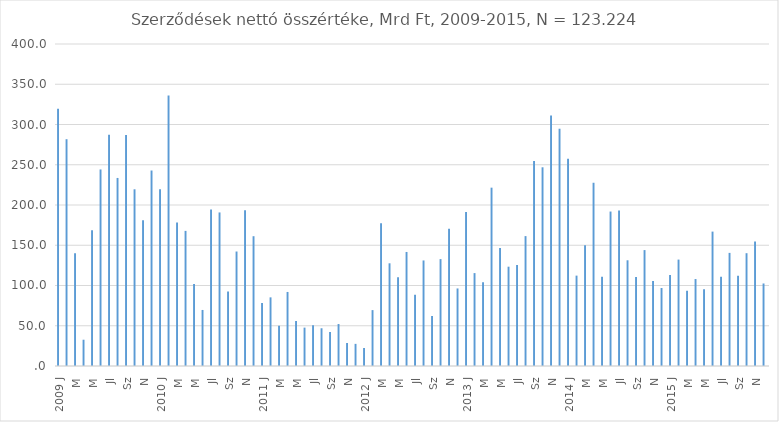
| Category | Series 0 | Series 1 |
|---|---|---|
| 2009 J | 319.526 | 0 |
| F | 281.743 | 0 |
| M | 140.104 | 0 |
| A | 32.635 | 0 |
| M | 168.664 | 0 |
| Jn | 244.154 | 0 |
| Jl | 287.342 | 0 |
| A | 233.607 | 0 |
| Sz | 286.963 | 0 |
| O | 219.525 | 0 |
| N | 181.191 | 0 |
| D | 242.847 | 0 |
| 2010 J | 219.451 | 0 |
| F | 336.069 | 0 |
| M | 178.277 | 0 |
| A | 167.846 | 0 |
| M | 101.887 | 0 |
| Jn | 69.615 | 0 |
| Jl | 194.381 | 0 |
| A | 190.761 | 0 |
| Sz | 92.613 | 0 |
| O | 142.223 | 0 |
| N | 193.624 | 0 |
| D | 161.237 | 0 |
| 2011 J | 78.269 | 0 |
| F | 85.271 | 0 |
| M | 50.062 | 0 |
| A | 91.986 | 0 |
| M | 55.811 | 0 |
| Jn | 47.673 | 0 |
| Jl | 50.538 | 0 |
| A | 46.897 | 0 |
| Sz | 42.104 | 0 |
| O | 52.137 | 0 |
| N | 28.422 | 0 |
| D | 27.495 | 0 |
| 2012 J | 22.393 | 0 |
| F | 69.438 | 0 |
| M | 177.272 | 0 |
| A | 127.578 | 0 |
| M | 110.107 | 0 |
| Jn | 141.655 | 0 |
| Jl | 88.572 | 0 |
| A | 131.121 | 0 |
| Sz | 62.098 | 0 |
| O | 132.781 | 0 |
| N | 170.457 | 0 |
| D | 96.335 | 0 |
| 2013 J | 191.156 | 0 |
| F | 115.414 | 0 |
| M | 104.168 | 0 |
| A | 221.543 | 0 |
| M | 146.484 | 0 |
| Jn | 123.368 | 0 |
| Jl | 125.448 | 0 |
| A | 161.359 | 0 |
| Sz | 254.641 | 0 |
| O | 246.845 | 0 |
| N | 311.073 | 0 |
| D | 294.748 | 0 |
| 2014 J | 257.402 | 0 |
| F | 112.268 | 0 |
| M | 150.099 | 0 |
| A | 227.629 | 0 |
| M | 110.715 | 0 |
| Jn | 191.878 | 0 |
| Jl | 193.171 | 0 |
| A | 131.33 | 0 |
| Sz | 110.69 | 0 |
| O | 143.998 | 0 |
| N | 105.653 | 0 |
| D | 96.896 | 0 |
| 2015 J | 113.126 | 0 |
| F | 132.191 | 0 |
| M | 93.441 | 0 |
| A | 108.013 | 0 |
| M | 95.26 | 0 |
| Jn | 166.955 | 0 |
| Jl | 110.961 | 0 |
| A | 140.514 | 0 |
| Sz | 112.259 | 0 |
| O | 140.139 | 0 |
| N | 154.702 | 0 |
| D | 102.51 | 0 |